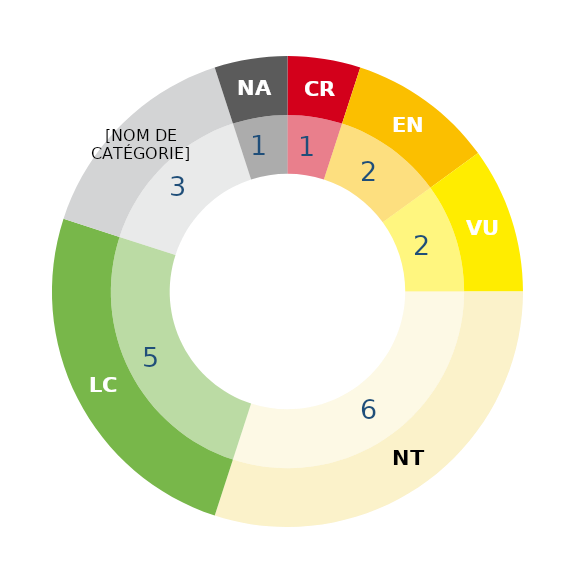
| Category | Series 1 | Series 0 |
|---|---|---|
| RE | 0 | 0 |
| CR | 1 | 1 |
| EN | 2 | 2 |
| VU | 2 | 2 |
| NT | 6 | 6 |
| LC | 5 | 5 |
| DD | 3 | 3 |
| NA | 1 | 1 |